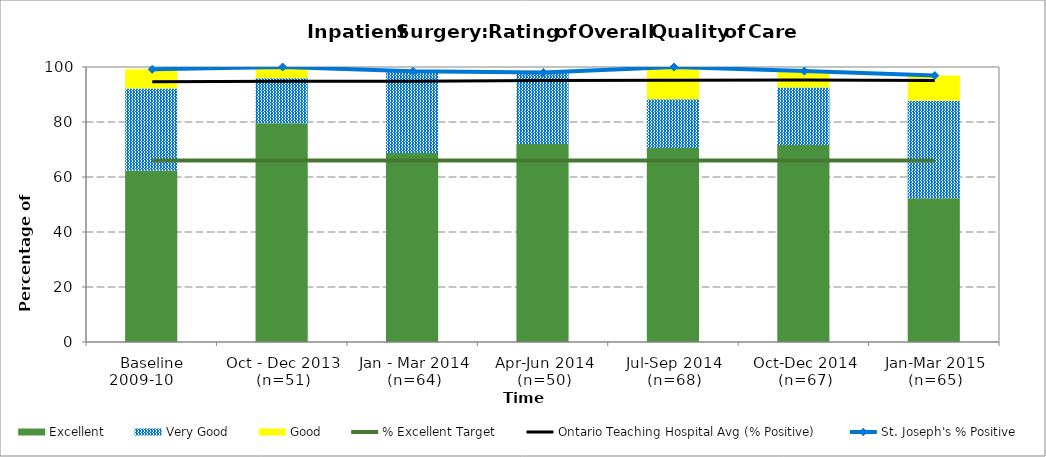
| Category | Excellent | Very Good | Good |
|---|---|---|---|
| Baseline 2009-10      | 62.37 | 29.81 | 6.98 |
| Oct - Dec 2013 (n=51) | 79.59 | 16.33 | 4.08 |
| Jan - Mar 2014 (n=64) | 68.75 | 29.69 | 0 |
| Apr-Jun 2014 (n=50) | 72 | 26 | 0 |
| Jul-Sep 2014 (n=68) | 70.59 | 17.65 | 11.76 |
| Oct-Dec 2014 (n=67) | 71.64 | 20.9 | 5.97 |
| Jan-Mar 2015 (n=65) | 52.3 | 35.4 | 9.2 |